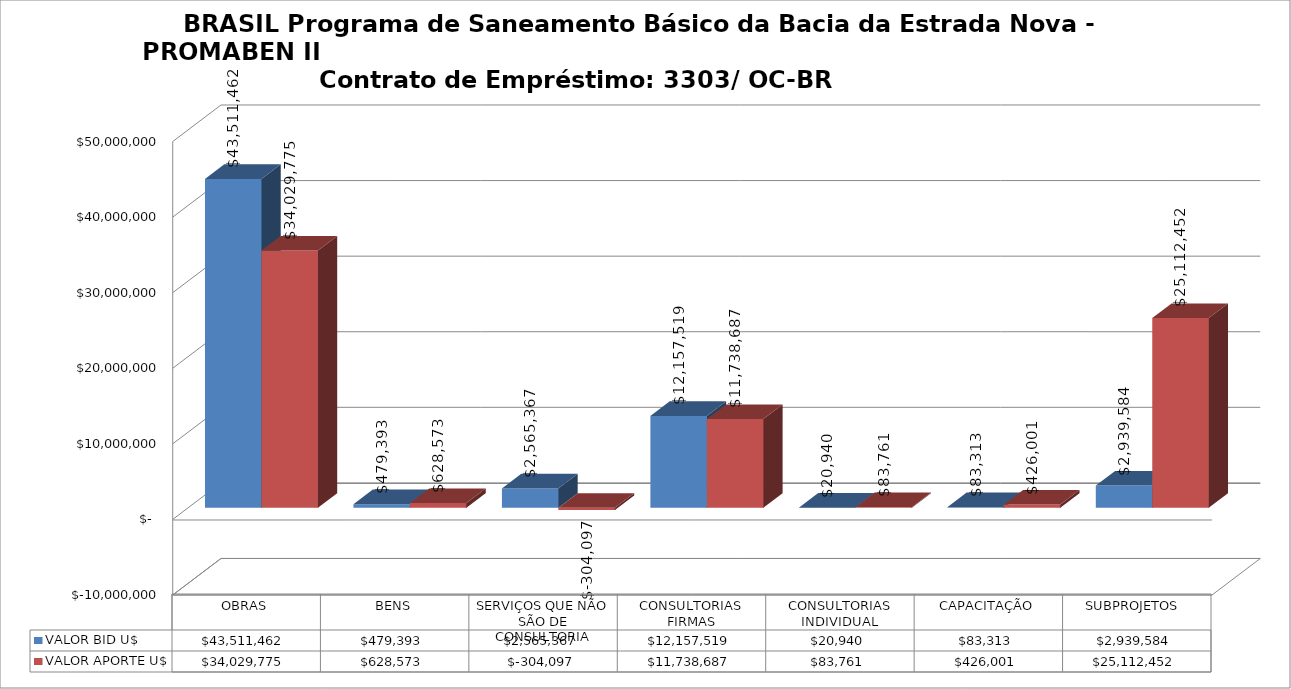
| Category | VALOR BID U$ | VALOR APORTE U$ |
|---|---|---|
| OBRAS | 43511461.63 | 34029774.82 |
| BENS | 479392.664 | 628573.12 |
| SERVIÇOS QUE NÃO SÃO DE CONSULTORIA | 2565366.88 | -304096.907 |
| CONSULTORIAS FIRMAS | 12157519.08 | 11738687.218 |
| CONSULTORIAS INDIVIDUAL | 20940.31 | 83761.28 |
| CAPACITAÇÃO | 83313.19 | 426001.2 |
| SUBPROJETOS  | 2939584.08 | 25112451.91 |